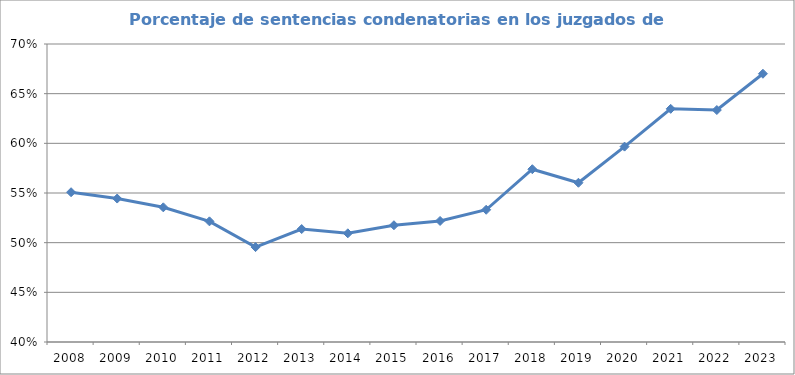
| Category | Porcentaje de Sentencias condenatorias |
|---|---|
| 2008.0 | 0.551 |
| 2009.0 | 0.544 |
| 2010.0 | 0.536 |
| 2011.0 | 0.521 |
| 2012.0 | 0.496 |
| 2013.0 | 0.514 |
| 2014.0 | 0.509 |
| 2015.0 | 0.518 |
| 2016.0 | 0.522 |
| 2017.0 | 0.533 |
| 2018.0 | 0.574 |
| 2019.0 | 0.56 |
| 2020.0 | 0.597 |
| 2021.0 | 0.635 |
| 2022.0 | 0.634 |
| 2023.0 | 0.67 |